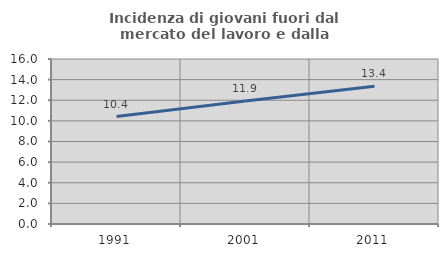
| Category | Incidenza di giovani fuori dal mercato del lavoro e dalla formazione  |
|---|---|
| 1991.0 | 10.421 |
| 2001.0 | 11.933 |
| 2011.0 | 13.363 |